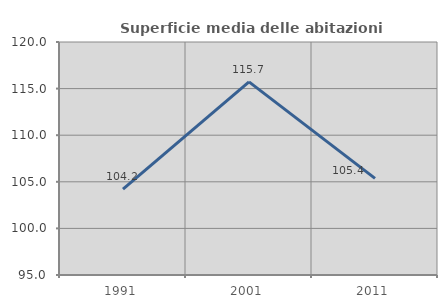
| Category | Superficie media delle abitazioni occupate |
|---|---|
| 1991.0 | 104.211 |
| 2001.0 | 115.721 |
| 2011.0 | 105.363 |